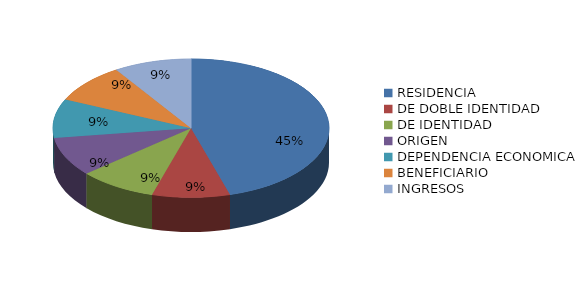
| Category | Series 0 |
|---|---|
| RESIDENCIA | 5 |
| DE DOBLE IDENTIDAD | 1 |
| DE IDENTIDAD | 1 |
| ORIGEN | 1 |
| DEPENDENCIA ECONOMICA | 1 |
| BENEFICIARIO | 1 |
| INGRESOS | 1 |